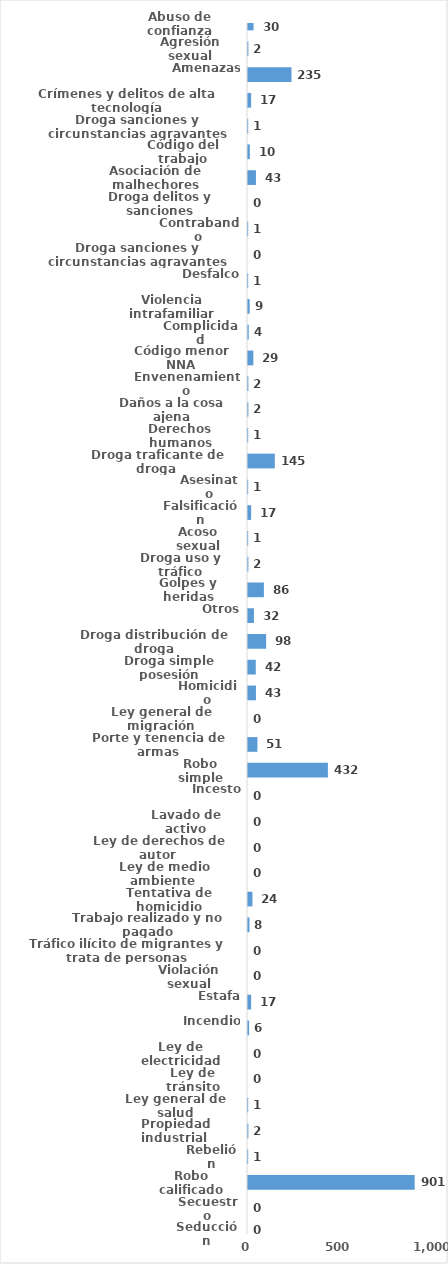
| Category | Series 0 |
|---|---|
| Abuso de confianza | 30 |
| Agresión sexual | 2 |
| Amenazas | 235 |
| Crímenes y delitos de alta tecnología | 17 |
| Droga sanciones y circunstancias agravantes | 1 |
| Código del trabajo | 10 |
| Asociación de malhechores | 43 |
| Droga delitos y sanciones | 0 |
| Contrabando | 1 |
| Droga sanciones y circunstancias agravantes | 0 |
| Desfalco | 1 |
| Violencia intrafamiliar | 9 |
| Complicidad | 4 |
| Código menor NNA | 29 |
| Envenenamiento | 2 |
| Daños a la cosa ajena | 2 |
| Derechos humanos | 1 |
| Droga traficante de droga  | 145 |
| Asesinato | 1 |
| Falsificación | 17 |
| Acoso sexual | 1 |
| Droga uso y tráfico | 2 |
| Golpes y heridas | 86 |
| Otros | 32 |
| Droga distribución de droga | 98 |
| Droga simple posesión | 42 |
| Homicidio | 43 |
| Ley general de migración | 0 |
| Porte y tenencia de armas | 51 |
| Robo simple | 432 |
| Incesto | 0 |
| Lavado de activo | 0 |
| Ley de derechos de autor  | 0 |
| Ley de medio ambiente  | 0 |
| Tentativa de homicidio | 24 |
| Trabajo realizado y no pagado | 8 |
| Tráfico ilícito de migrantes y trata de personas | 0 |
| Violación sexual | 0 |
| Estafa | 17 |
| Incendio | 6 |
| Ley de electricidad | 0 |
| Ley de tránsito | 0 |
| Ley general de salud | 1 |
| Propiedad industrial  | 2 |
| Rebelión | 1 |
| Robo calificado | 901 |
| Secuestro | 0 |
| Seducción | 0 |